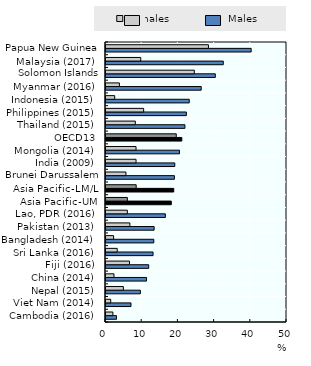
| Category | Males | Females |
|---|---|---|
| Cambodia (2016) | 2.9 | 1.9 |
| Viet Nam (2014) | 6.9 | 1.3 |
| Nepal (2015) | 9.5 | 4.8 |
| China (2014) | 11.2 | 2.2 |
| Fiji (2016) | 11.8 | 6.5 |
| Sri Lanka (2016) | 13 | 3.1 |
| Bangladesh (2014) | 13.2 | 2.1 |
| Pakistan (2013) | 13.3 | 6.6 |
| Lao, PDR (2016) | 16.4 | 5.9 |
| Asia Pacific-UM | 18.04 | 5.9 |
| Asia Pacific-LM/L | 18.715 | 8.338 |
| Brunei Darussalem (2014) | 18.9 | 5.5 |
| India (2009) | 19 | 8.3 |
| Mongolia (2014) | 20.3 | 8.3 |
| OECD13 | 20.938 | 19.408 |
| Thailand (2015) | 21.8 | 8.1 |
| Philippines (2015) | 22.2 | 10.4 |
| Indonesia (2015) | 23 | 2.4 |
| Myanmar (2016) | 26.3 | 3.7 |
| Solomon Islands (2011) | 30.2 | 24.4 |
| Malaysia (2017) | 32.4 | 9.6 |
| Papua New Guinea (2016) | 40.1 | 28.3 |